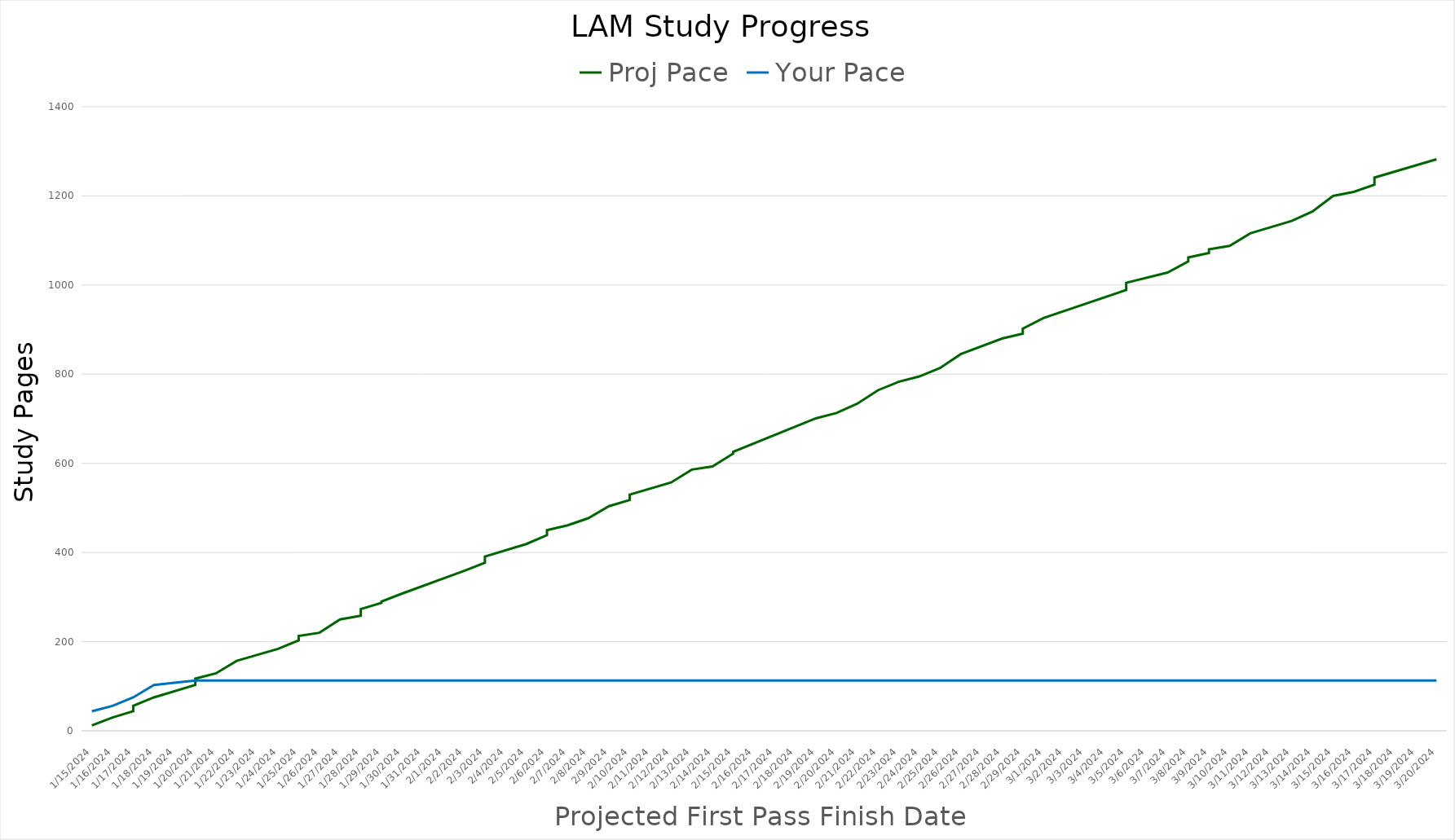
| Category | Proj Pace | Your Pace |
|---|---|---|
| 1/15/24 | 12 | 44 |
| 1/16/24 | 30 | 56 |
| 1/17/24 | 44 | 75 |
| 1/17/24 | 56 | 75 |
| 1/18/24 | 75 | 103 |
| 1/20/24 | 103 | 113 |
| 1/20/24 | 113 | 113 |
| 1/20/24 | 117 | 113 |
| 1/21/24 | 129 | 113 |
| 1/22/24 | 157 | 113 |
| 1/24/24 | 184 | 113 |
| 1/25/24 | 203 | 113 |
| 1/25/24 | 213 | 113 |
| 1/26/24 | 220 | 113 |
| 1/27/24 | 250 | 113 |
| 1/28/24 | 258 | 113 |
| 1/28/24 | 273 | 113 |
| 1/29/24 | 287 | 113 |
| 1/29/24 | 290 | 113 |
| 1/29/24 | 290 | 113 |
| 1/30/24 | 308 | 113 |
| 2/2/24 | 359 | 113 |
| 2/3/24 | 377 | 113 |
| 2/3/24 | 391 | 113 |
| 2/5/24 | 419 | 113 |
| 2/6/24 | 439 | 113 |
| 2/6/24 | 450 | 113 |
| 2/7/24 | 461 | 113 |
| 2/8/24 | 477 | 113 |
| 2/9/24 | 504 | 113 |
| 2/10/24 | 518 | 113 |
| 2/10/24 | 520 | 113 |
| 2/10/24 | 524 | 113 |
| 2/10/24 | 530 | 113 |
| 2/10/24 | 530 | 113 |
| 2/12/24 | 557 | 113 |
| 2/13/24 | 586 | 113 |
| 2/14/24 | 593 | 113 |
| 2/15/24 | 622 | 113 |
| 2/15/24 | 626 | 113 |
| 2/19/24 | 701 | 113 |
| 2/20/24 | 713 | 113 |
| 2/21/24 | 734 | 113 |
| 2/22/24 | 764 | 113 |
| 2/23/24 | 783 | 113 |
| 2/23/24 | 783 | 113 |
| 2/24/24 | 795 | 113 |
| 2/25/24 | 814 | 113 |
| 2/26/24 | 845 | 113 |
| 2/28/24 | 880 | 113 |
| 2/29/24 | 891 | 113 |
| 2/29/24 | 902 | 113 |
| 3/1/24 | 926 | 113 |
| 3/5/24 | 989 | 113 |
| 3/5/24 | 1005 | 113 |
| 3/7/24 | 1028 | 113 |
| 3/8/24 | 1053 | 113 |
| 3/8/24 | 1062 | 113 |
| 3/9/24 | 1072 | 113 |
| 3/9/24 | 1072 | 113 |
| 3/9/24 | 1080 | 113 |
| 3/10/24 | 1088 | 113 |
| 3/11/24 | 1116 | 113 |
| 3/13/24 | 1144 | 113 |
| 3/14/24 | 1165 | 113 |
| 3/15/24 | 1200 | 113 |
| 3/16/24 | 1209 | 113 |
| 3/17/24 | 1225 | 113 |
| 3/17/24 | 1229 | 113 |
| 3/17/24 | 1233 | 113 |
| 3/17/24 | 1241 | 113 |
| 3/20/24 | 1282 | 113 |